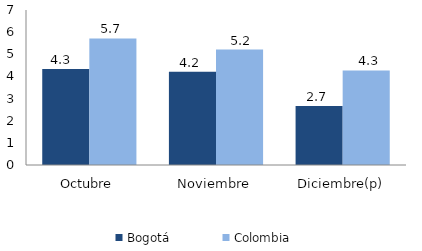
| Category | Bogotá | Colombia |
|---|---|---|
| Octubre | 4.341 | 5.718 |
| Noviembre | 4.213 | 5.213 |
| Diciembre(p) | 2.661 | 4.268 |